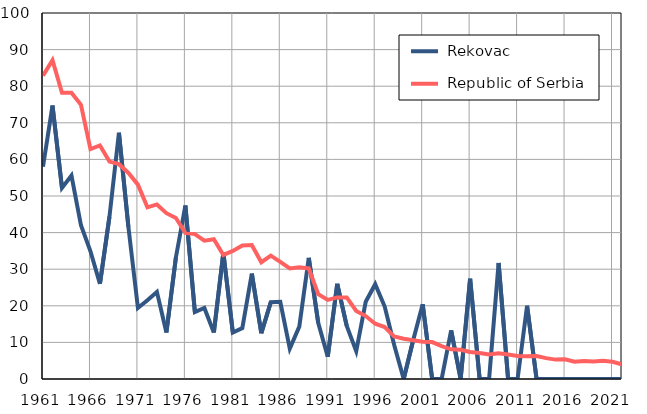
| Category |  Rekovac |  Republic of Serbia |
|---|---|---|
| 1961.0 | 58 | 82.9 |
| 1962.0 | 74.7 | 87.1 |
| 1963.0 | 52.2 | 78.2 |
| 1964.0 | 55.6 | 78.2 |
| 1965.0 | 42 | 74.9 |
| 1966.0 | 34.9 | 62.8 |
| 1967.0 | 26 | 63.8 |
| 1968.0 | 44.3 | 59.4 |
| 1969.0 | 67.3 | 58.7 |
| 1970.0 | 41.5 | 56.3 |
| 1971.0 | 19.4 | 53.1 |
| 1972.0 | 21.5 | 46.9 |
| 1973.0 | 23.8 | 47.7 |
| 1974.0 | 12.7 | 45.3 |
| 1975.0 | 33.2 | 44 |
| 1976.0 | 47.4 | 39.9 |
| 1977.0 | 18.3 | 39.6 |
| 1978.0 | 19.4 | 37.8 |
| 1979.0 | 12.7 | 38.2 |
| 1980.0 | 34.5 | 33.9 |
| 1981.0 | 12.7 | 35 |
| 1982.0 | 13.9 | 36.5 |
| 1983.0 | 28.8 | 36.6 |
| 1984.0 | 12.5 | 31.9 |
| 1985.0 | 21 | 33.7 |
| 1986.0 | 21.1 | 32 |
| 1987.0 | 8.3 | 30.2 |
| 1988.0 | 14.3 | 30.5 |
| 1989.0 | 33.1 | 30.2 |
| 1990.0 | 15.3 | 23.2 |
| 1991.0 | 6.1 | 21.6 |
| 1992.0 | 26 | 22.3 |
| 1993.0 | 14.5 | 22.3 |
| 1994.0 | 7.6 | 18.6 |
| 1995.0 | 21.1 | 17.2 |
| 1996.0 | 25.9 | 15.1 |
| 1997.0 | 19.8 | 14.2 |
| 1998.0 | 9.3 | 11.6 |
| 1999.0 | 0 | 11 |
| 2000.0 | 10.6 | 10.6 |
| 2001.0 | 20.4 | 10.2 |
| 2002.0 | 0 | 10.1 |
| 2003.0 | 0 | 9 |
| 2004.0 | 13.3 | 8.1 |
| 2005.0 | 0 | 8 |
| 2006.0 | 27.4 | 7.4 |
| 2007.0 | 0 | 7.1 |
| 2008.0 | 0 | 6.7 |
| 2009.0 | 31.7 | 7 |
| 2010.0 | 0 | 6.7 |
| 2011.0 | 0 | 6.3 |
| 2012.0 | 20 | 6.2 |
| 2013.0 | 0 | 6.3 |
| 2014.0 | 0 | 5.7 |
| 2015.0 | 0 | 5.3 |
| 2016.0 | 0 | 5.4 |
| 2017.0 | 0 | 4.7 |
| 2018.0 | 0 | 4.9 |
| 2019.0 | 0 | 4.8 |
| 2020.0 | 0 | 5 |
| 2021.0 | 0 | 4.7 |
| 2022.0 | 0 | 4 |